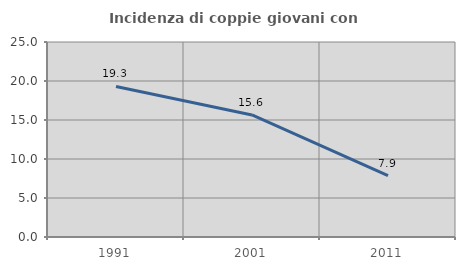
| Category | Incidenza di coppie giovani con figli |
|---|---|
| 1991.0 | 19.298 |
| 2001.0 | 15.646 |
| 2011.0 | 7.884 |